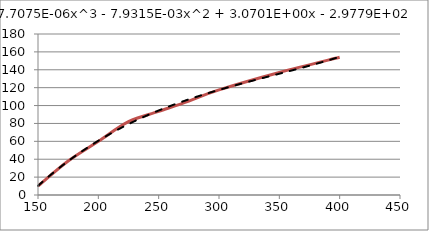
| Category | Series 0 |
|---|---|
| 150.0 | 10 |
| 175.0 | 38 |
| 200.0 | 60 |
| 225.0 | 82 |
| 250.0 | 93.5 |
| 275.0 | 105 |
| 300.0 | 117.5 |
| 350.0 | 137 |
| 400.0 | 154 |